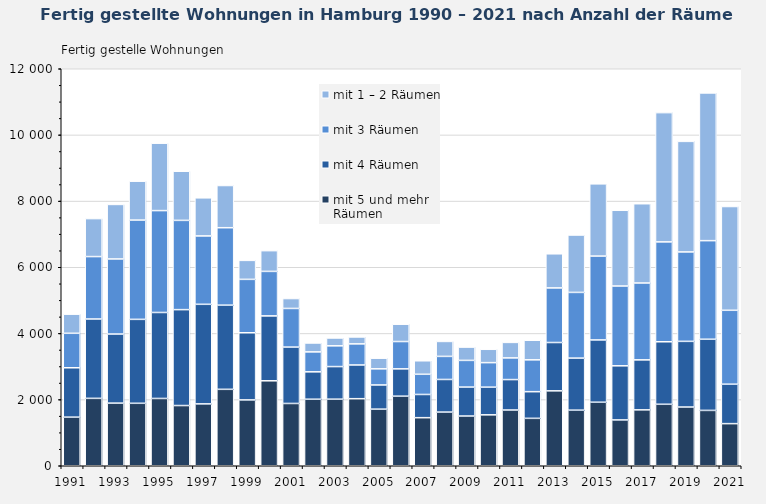
| Category | mit 5 und mehr Räumen | mit 4 Räumen | mit 3 Räumen | mit 1 – 2 Räumen |
|---|---|---|---|---|
| 1991.0 | 1469 | 1493 | 1042 | 578 |
| 1992.0 | 2037 | 2399 | 1887 | 1148 |
| 1993.0 | 1893 | 2088 | 2270 | 1648 |
| 1994.0 | 1888 | 2537 | 3001 | 1175 |
| 1995.0 | 2034 | 2599 | 3080 | 2037 |
| 1996.0 | 1820 | 2899 | 2698 | 1485 |
| 1997.0 | 1870 | 3010 | 2067 | 1152 |
| 1998.0 | 2310 | 2544 | 2341 | 1276 |
| 1999.0 | 1990 | 2030 | 1614 | 574 |
| 2000.0 | 2568 | 1962 | 1345 | 627 |
| 2001.0 | 1883 | 1704 | 1168 | 299 |
| 2002.0 | 2011 | 828 | 603 | 269 |
| 2003.0 | 2012 | 986 | 627 | 237 |
| 2004.0 | 2027 | 1019 | 638 | 209 |
| 2005.0 | 1711 | 731 | 488 | 321 |
| 2006.0 | 2103 | 826 | 826 | 523 |
| 2007.0 | 1453 | 702 | 610 | 408 |
| 2008.0 | 1622 | 986 | 698 | 452 |
| 2009.0 | 1503 | 875 | 807 | 402 |
| 2010.0 | 1539 | 837 | 741 | 403 |
| 2011.0 | 1685 | 920 | 655 | 469 |
| 2012.0 | 1433 | 806 | 963 | 591 |
| 2013.0 | 2264 | 1461 | 1651 | 1031 |
| 2014.0 | 1680 | 1574 | 1986 | 1734 |
| 2015.0 | 1920 | 1883 | 2535 | 2183 |
| 2016.0 | 1385 | 1636 | 2412 | 2289 |
| 2017.0 | 1689 | 1512 | 2323 | 2396 |
| 2018.0 | 1858 | 1890 | 3019 | 3907 |
| 2019.0 | 1775 | 1985 | 2703 | 3342 |
| 2020.0 | 1673 | 2151 | 2980 | 4465 |
| 2021.0 | 1273 | 1192 | 2234 | 3137 |